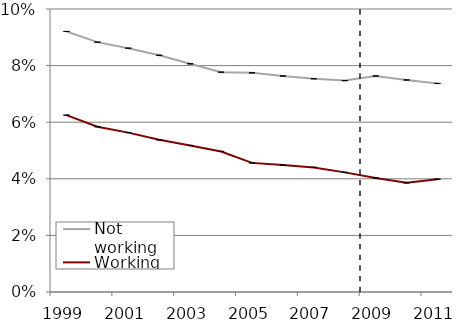
| Category | Not working | Working |
|---|---|---|
| 1999.0 | 0.092 | 0.062 |
| 2000.0 | 0.088 | 0.058 |
| 2001.0 | 0.086 | 0.056 |
| 2002.0 | 0.084 | 0.054 |
| 2003.0 | 0.081 | 0.052 |
| 2004.0 | 0.078 | 0.05 |
| 2005.0 | 0.077 | 0.046 |
| 2006.0 | 0.076 | 0.045 |
| 2007.0 | 0.075 | 0.044 |
| 2008.0 | 0.075 | 0.042 |
| 2009.0 | 0.076 | 0.04 |
| 2010.0 | 0.075 | 0.039 |
| 2011.0 | 0.074 | 0.04 |